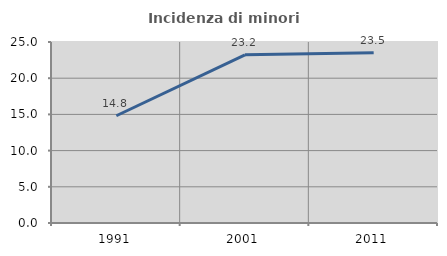
| Category | Incidenza di minori stranieri |
|---|---|
| 1991.0 | 14.815 |
| 2001.0 | 23.226 |
| 2011.0 | 23.508 |